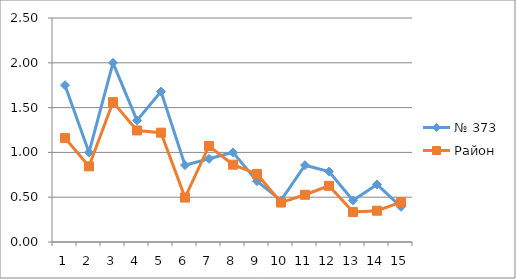
| Category | № 373 | Район |
|---|---|---|
| 0 | 1.75 | 1.16 |
| 1 | 1 | 0.844 |
| 2 | 2 | 1.562 |
| 3 | 1.357 | 1.245 |
| 4 | 1.679 | 1.22 |
| 5 | 0.857 | 0.496 |
| 6 | 0.929 | 1.072 |
| 7 | 1 | 0.863 |
| 8 | 0.679 | 0.76 |
| 9 | 0.464 | 0.44 |
| 10 | 0.857 | 0.527 |
| 11 | 0.786 | 0.627 |
| 12 | 0.464 | 0.334 |
| 13 | 0.643 | 0.349 |
| 14 | 0.393 | 0.445 |